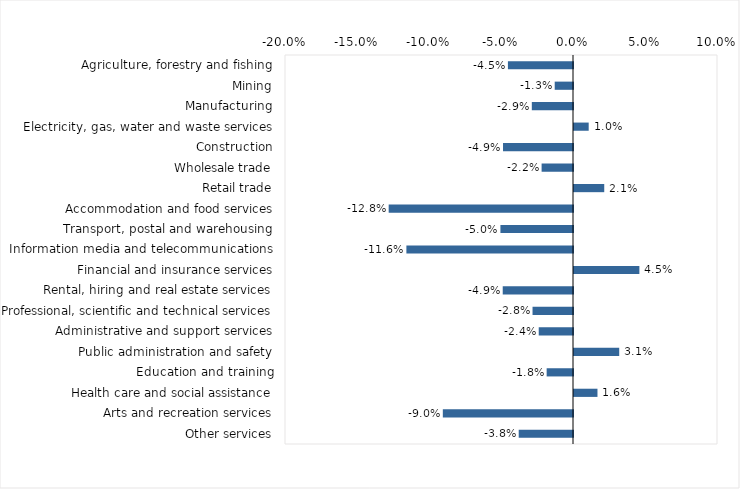
| Category | This week |
|---|---|
| Agriculture, forestry and fishing | -0.045 |
| Mining | -0.013 |
| Manufacturing | -0.029 |
| Electricity, gas, water and waste services | 0.01 |
| Construction | -0.049 |
| Wholesale trade | -0.022 |
| Retail trade | 0.021 |
| Accommodation and food services | -0.128 |
| Transport, postal and warehousing | -0.05 |
| Information media and telecommunications | -0.116 |
| Financial and insurance services | 0.045 |
| Rental, hiring and real estate services | -0.049 |
| Professional, scientific and technical services | -0.028 |
| Administrative and support services | -0.024 |
| Public administration and safety | 0.031 |
| Education and training | -0.018 |
| Health care and social assistance | 0.016 |
| Arts and recreation services | -0.09 |
| Other services | -0.038 |